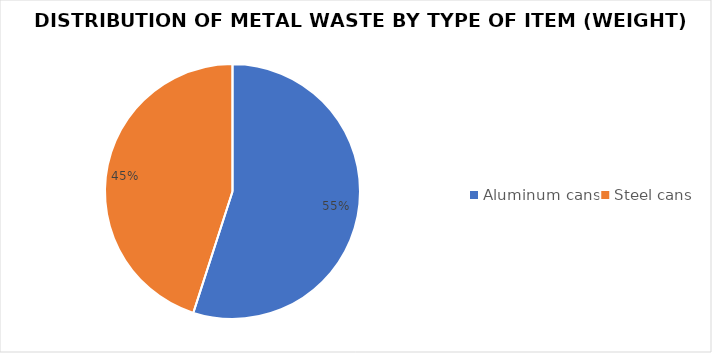
| Category | Series 0 |
|---|---|
| Aluminum cans | 22.14 |
| Steel cans | 18.135 |